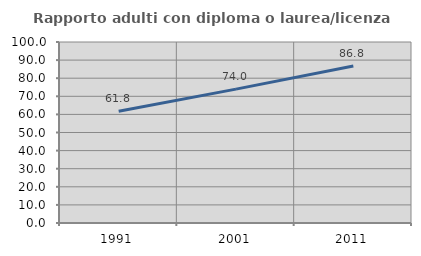
| Category | Rapporto adulti con diploma o laurea/licenza media  |
|---|---|
| 1991.0 | 61.767 |
| 2001.0 | 73.955 |
| 2011.0 | 86.759 |